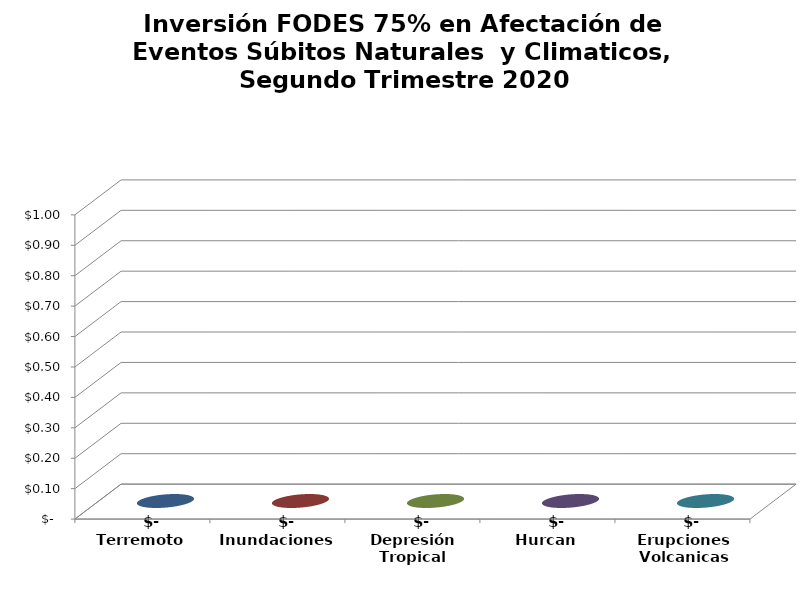
| Category | Series 0 |
|---|---|
| Terremoto | 0 |
| Inundaciones | 0 |
| Depresión Tropical | 0 |
| Hurcan | 0 |
| Erupciones Volcanicas | 0 |